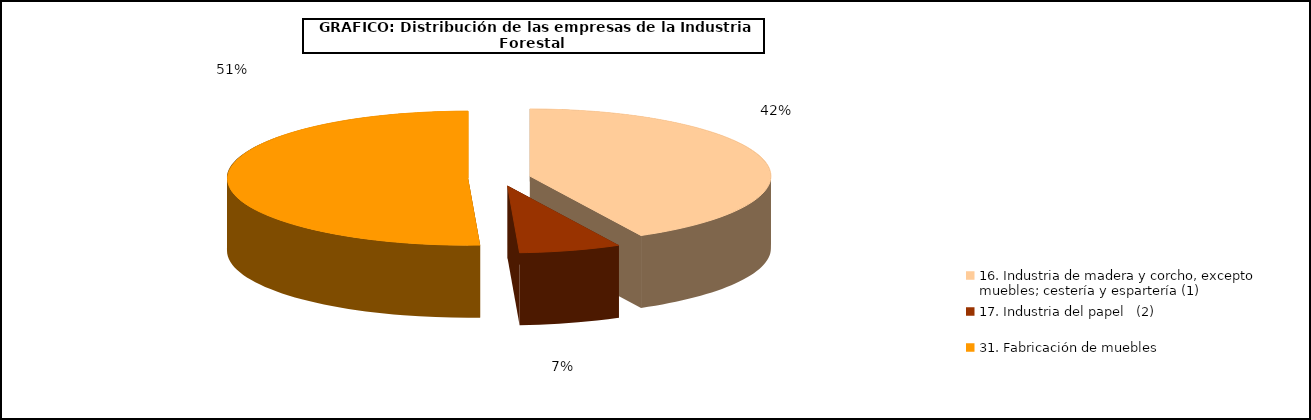
| Category | Series 0 |
|---|---|
| 16. Industria de madera y corcho, excepto  muebles; cestería y espartería (1) | 42.367 |
| 17. Industria del papel   (2) | 6.839 |
| 31. Fabricación de muebles  | 50.794 |